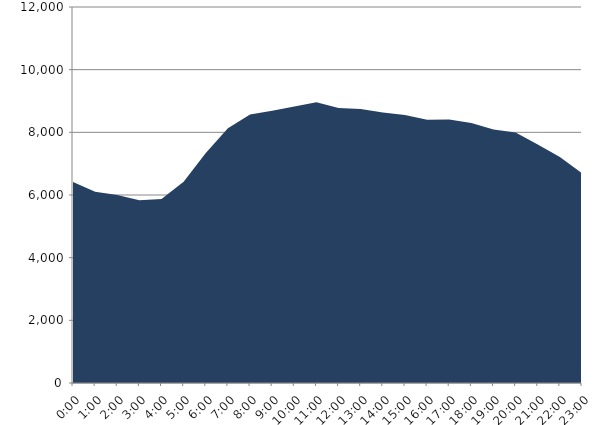
| Category | Series 0 | Series 1 |
|---|---|---|
| 2016-08-17 |  | 6412.317 |
| 2016-08-17 01:00:00 |  | 6100.571 |
| 2016-08-17 02:00:00 |  | 5996.578 |
| 2016-08-17 03:00:00 |  | 5831.274 |
| 2016-08-17 04:00:00 |  | 5876.222 |
| 2016-08-17 05:00:00 |  | 6425.008 |
| 2016-08-17 06:00:00 |  | 7337.749 |
| 2016-08-17 07:00:00 |  | 8131.214 |
| 2016-08-17 08:00:00 |  | 8565.793 |
| 2016-08-17 09:00:00 |  | 8692.765 |
| 2016-08-17 10:00:00 |  | 8824.881 |
| 2016-08-17 11:00:00 |  | 8962.589 |
| 2016-08-17 12:00:00 |  | 8779.096 |
| 2016-08-17 13:00:00 |  | 8744.584 |
| 2016-08-17 14:00:00 |  | 8634.1 |
| 2016-08-17 15:00:00 |  | 8555.737 |
| 2016-08-17 16:00:00 |  | 8399.479 |
| 2016-08-17 17:00:00 |  | 8410.011 |
| 2016-08-17 18:00:00 |  | 8295.17 |
| 2016-08-17 19:00:00 |  | 8091.194 |
| 2016-08-17 20:00:00 |  | 7992.724 |
| 2016-08-17 21:00:00 |  | 7614.1 |
| 2016-08-17 22:00:00 |  | 7215.625 |
| 2016-08-17 23:00:00 |  | 6696.533 |